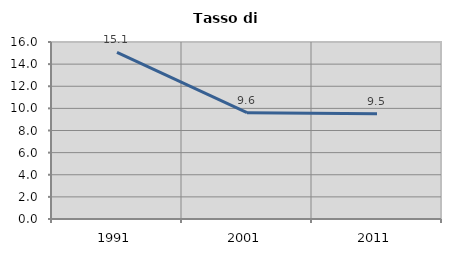
| Category | Tasso di disoccupazione   |
|---|---|
| 1991.0 | 15.06 |
| 2001.0 | 9.615 |
| 2011.0 | 9.524 |